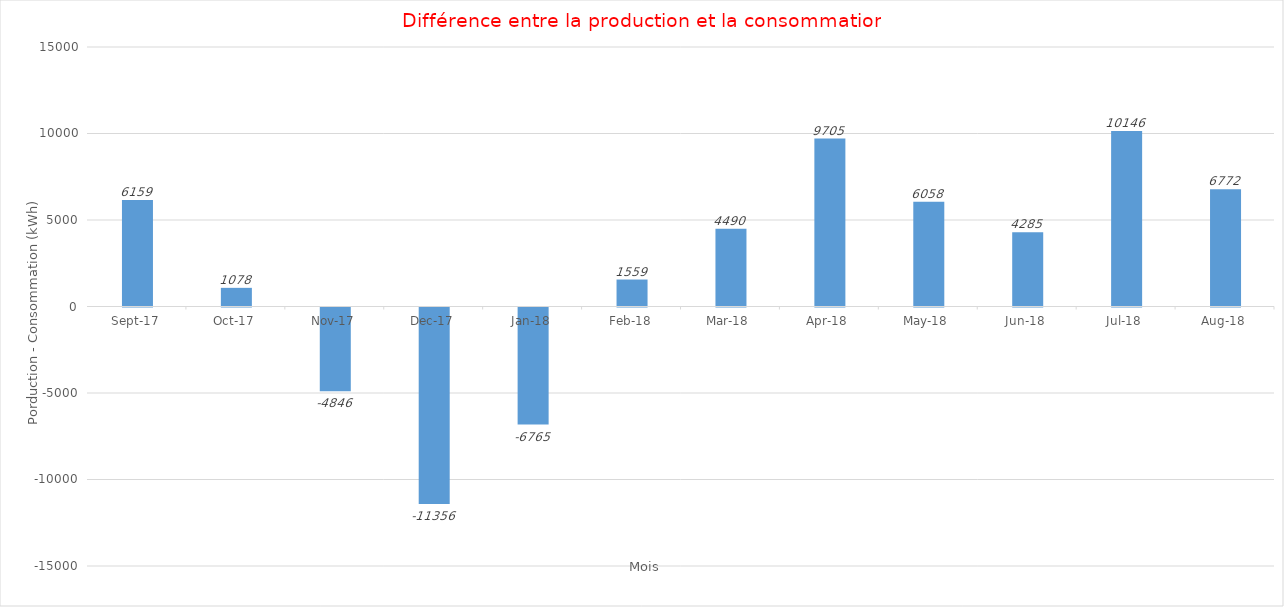
| Category | Series 0 |
|---|---|
| 2017-09-01 | 6159.2 |
| 2017-10-01 | 1078.4 |
| 2017-11-01 | -4845.6 |
| 2017-12-01 | -11356 |
| 2018-01-01 | -6764.8 |
| 2018-02-01 | 1559.2 |
| 2018-03-01 | 4489.6 |
| 2018-04-01 | 9704.8 |
| 2018-05-01 | 6058.4 |
| 2018-06-01 | 4284.8 |
| 2018-07-01 | 10145.6 |
| 2018-08-01 | 6772 |